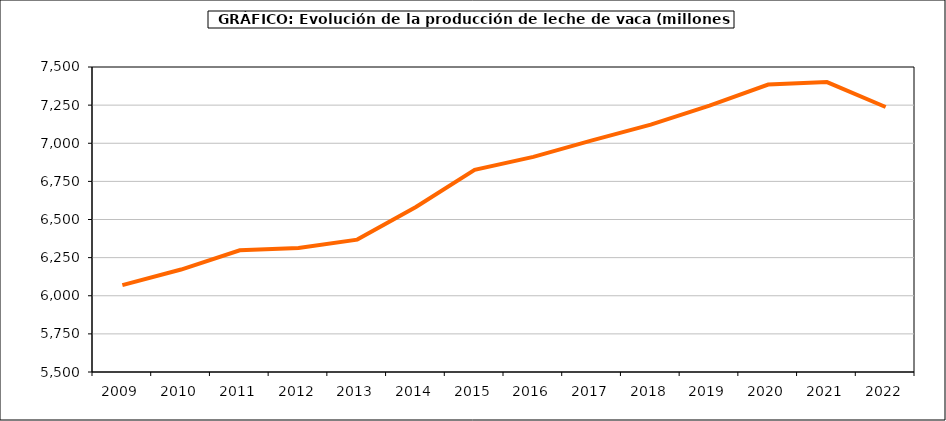
| Category | leche vaca |
|---|---|
| 2009.0 | 6069.364 |
| 2010.0 | 6171.9 |
| 2011.0 | 6298.47 |
| 2012.0 | 6313.014 |
| 2013.0 | 6368.131 |
| 2014.0 | 6582.284 |
| 2015.0 | 6825.141 |
| 2016.0 | 6910.608 |
| 2017.0 | 7018.786 |
| 2018.0 | 7121.965 |
| 2019.0 | 7246.416 |
| 2020.0 | 7384.533 |
| 2021.0 | 7401.056 |
| 2022.0 | 7237.836 |